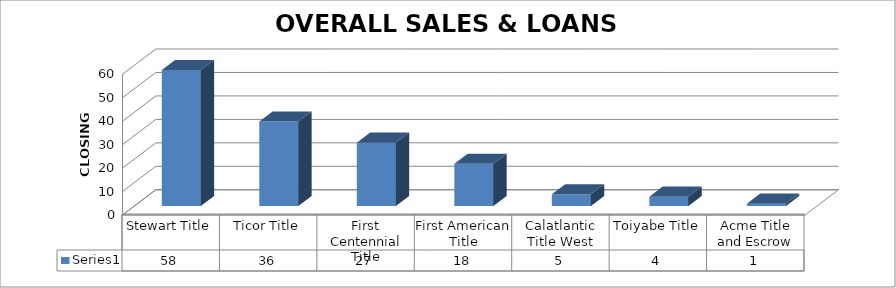
| Category | Series 0 |
|---|---|
| Stewart Title | 58 |
| Ticor Title | 36 |
| First Centennial Title | 27 |
| First American Title | 18 |
| Calatlantic Title West | 5 |
| Toiyabe Title | 4 |
| Acme Title and Escrow | 1 |